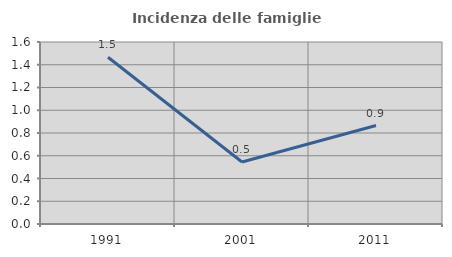
| Category | Incidenza delle famiglie numerose |
|---|---|
| 1991.0 | 1.466 |
| 2001.0 | 0.545 |
| 2011.0 | 0.866 |